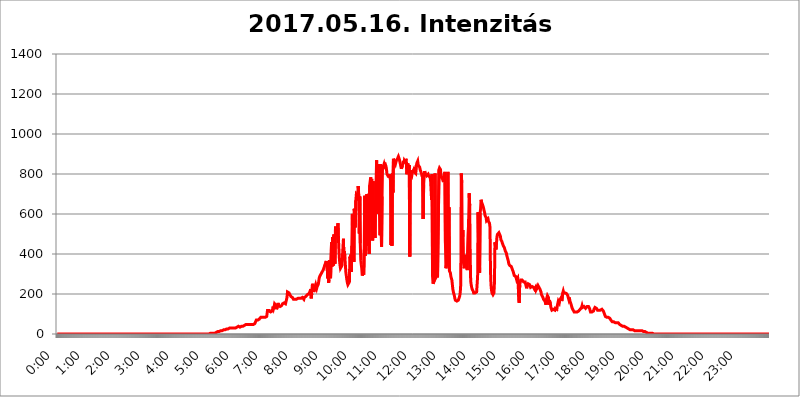
| Category | 2017.05.16. Intenzitás [W/m^2] |
|---|---|
| 0.0 | 0 |
| 0.0006944444444444445 | 0 |
| 0.001388888888888889 | 0 |
| 0.0020833333333333333 | 0 |
| 0.002777777777777778 | 0 |
| 0.003472222222222222 | 0 |
| 0.004166666666666667 | 0 |
| 0.004861111111111111 | 0 |
| 0.005555555555555556 | 0 |
| 0.0062499999999999995 | 0 |
| 0.006944444444444444 | 0 |
| 0.007638888888888889 | 0 |
| 0.008333333333333333 | 0 |
| 0.009027777777777779 | 0 |
| 0.009722222222222222 | 0 |
| 0.010416666666666666 | 0 |
| 0.011111111111111112 | 0 |
| 0.011805555555555555 | 0 |
| 0.012499999999999999 | 0 |
| 0.013194444444444444 | 0 |
| 0.013888888888888888 | 0 |
| 0.014583333333333332 | 0 |
| 0.015277777777777777 | 0 |
| 0.015972222222222224 | 0 |
| 0.016666666666666666 | 0 |
| 0.017361111111111112 | 0 |
| 0.018055555555555557 | 0 |
| 0.01875 | 0 |
| 0.019444444444444445 | 0 |
| 0.02013888888888889 | 0 |
| 0.020833333333333332 | 0 |
| 0.02152777777777778 | 0 |
| 0.022222222222222223 | 0 |
| 0.02291666666666667 | 0 |
| 0.02361111111111111 | 0 |
| 0.024305555555555556 | 0 |
| 0.024999999999999998 | 0 |
| 0.025694444444444447 | 0 |
| 0.02638888888888889 | 0 |
| 0.027083333333333334 | 0 |
| 0.027777777777777776 | 0 |
| 0.02847222222222222 | 0 |
| 0.029166666666666664 | 0 |
| 0.029861111111111113 | 0 |
| 0.030555555555555555 | 0 |
| 0.03125 | 0 |
| 0.03194444444444445 | 0 |
| 0.03263888888888889 | 0 |
| 0.03333333333333333 | 0 |
| 0.034027777777777775 | 0 |
| 0.034722222222222224 | 0 |
| 0.035416666666666666 | 0 |
| 0.036111111111111115 | 0 |
| 0.03680555555555556 | 0 |
| 0.0375 | 0 |
| 0.03819444444444444 | 0 |
| 0.03888888888888889 | 0 |
| 0.03958333333333333 | 0 |
| 0.04027777777777778 | 0 |
| 0.04097222222222222 | 0 |
| 0.041666666666666664 | 0 |
| 0.042361111111111106 | 0 |
| 0.04305555555555556 | 0 |
| 0.043750000000000004 | 0 |
| 0.044444444444444446 | 0 |
| 0.04513888888888889 | 0 |
| 0.04583333333333334 | 0 |
| 0.04652777777777778 | 0 |
| 0.04722222222222222 | 0 |
| 0.04791666666666666 | 0 |
| 0.04861111111111111 | 0 |
| 0.049305555555555554 | 0 |
| 0.049999999999999996 | 0 |
| 0.05069444444444445 | 0 |
| 0.051388888888888894 | 0 |
| 0.052083333333333336 | 0 |
| 0.05277777777777778 | 0 |
| 0.05347222222222222 | 0 |
| 0.05416666666666667 | 0 |
| 0.05486111111111111 | 0 |
| 0.05555555555555555 | 0 |
| 0.05625 | 0 |
| 0.05694444444444444 | 0 |
| 0.057638888888888885 | 0 |
| 0.05833333333333333 | 0 |
| 0.05902777777777778 | 0 |
| 0.059722222222222225 | 0 |
| 0.06041666666666667 | 0 |
| 0.061111111111111116 | 0 |
| 0.06180555555555556 | 0 |
| 0.0625 | 0 |
| 0.06319444444444444 | 0 |
| 0.06388888888888888 | 0 |
| 0.06458333333333334 | 0 |
| 0.06527777777777778 | 0 |
| 0.06597222222222222 | 0 |
| 0.06666666666666667 | 0 |
| 0.06736111111111111 | 0 |
| 0.06805555555555555 | 0 |
| 0.06874999999999999 | 0 |
| 0.06944444444444443 | 0 |
| 0.07013888888888889 | 0 |
| 0.07083333333333333 | 0 |
| 0.07152777777777779 | 0 |
| 0.07222222222222223 | 0 |
| 0.07291666666666667 | 0 |
| 0.07361111111111111 | 0 |
| 0.07430555555555556 | 0 |
| 0.075 | 0 |
| 0.07569444444444444 | 0 |
| 0.0763888888888889 | 0 |
| 0.07708333333333334 | 0 |
| 0.07777777777777778 | 0 |
| 0.07847222222222222 | 0 |
| 0.07916666666666666 | 0 |
| 0.0798611111111111 | 0 |
| 0.08055555555555556 | 0 |
| 0.08125 | 0 |
| 0.08194444444444444 | 0 |
| 0.08263888888888889 | 0 |
| 0.08333333333333333 | 0 |
| 0.08402777777777777 | 0 |
| 0.08472222222222221 | 0 |
| 0.08541666666666665 | 0 |
| 0.08611111111111112 | 0 |
| 0.08680555555555557 | 0 |
| 0.08750000000000001 | 0 |
| 0.08819444444444445 | 0 |
| 0.08888888888888889 | 0 |
| 0.08958333333333333 | 0 |
| 0.09027777777777778 | 0 |
| 0.09097222222222222 | 0 |
| 0.09166666666666667 | 0 |
| 0.09236111111111112 | 0 |
| 0.09305555555555556 | 0 |
| 0.09375 | 0 |
| 0.09444444444444444 | 0 |
| 0.09513888888888888 | 0 |
| 0.09583333333333333 | 0 |
| 0.09652777777777777 | 0 |
| 0.09722222222222222 | 0 |
| 0.09791666666666667 | 0 |
| 0.09861111111111111 | 0 |
| 0.09930555555555555 | 0 |
| 0.09999999999999999 | 0 |
| 0.10069444444444443 | 0 |
| 0.1013888888888889 | 0 |
| 0.10208333333333335 | 0 |
| 0.10277777777777779 | 0 |
| 0.10347222222222223 | 0 |
| 0.10416666666666667 | 0 |
| 0.10486111111111111 | 0 |
| 0.10555555555555556 | 0 |
| 0.10625 | 0 |
| 0.10694444444444444 | 0 |
| 0.1076388888888889 | 0 |
| 0.10833333333333334 | 0 |
| 0.10902777777777778 | 0 |
| 0.10972222222222222 | 0 |
| 0.1111111111111111 | 0 |
| 0.11180555555555556 | 0 |
| 0.11180555555555556 | 0 |
| 0.1125 | 0 |
| 0.11319444444444444 | 0 |
| 0.11388888888888889 | 0 |
| 0.11458333333333333 | 0 |
| 0.11527777777777777 | 0 |
| 0.11597222222222221 | 0 |
| 0.11666666666666665 | 0 |
| 0.1173611111111111 | 0 |
| 0.11805555555555557 | 0 |
| 0.11944444444444445 | 0 |
| 0.12013888888888889 | 0 |
| 0.12083333333333333 | 0 |
| 0.12152777777777778 | 0 |
| 0.12222222222222223 | 0 |
| 0.12291666666666667 | 0 |
| 0.12291666666666667 | 0 |
| 0.12361111111111112 | 0 |
| 0.12430555555555556 | 0 |
| 0.125 | 0 |
| 0.12569444444444444 | 0 |
| 0.12638888888888888 | 0 |
| 0.12708333333333333 | 0 |
| 0.16875 | 0 |
| 0.12847222222222224 | 0 |
| 0.12916666666666668 | 0 |
| 0.12986111111111112 | 0 |
| 0.13055555555555556 | 0 |
| 0.13125 | 0 |
| 0.13194444444444445 | 0 |
| 0.1326388888888889 | 0 |
| 0.13333333333333333 | 0 |
| 0.13402777777777777 | 0 |
| 0.13402777777777777 | 0 |
| 0.13472222222222222 | 0 |
| 0.13541666666666666 | 0 |
| 0.1361111111111111 | 0 |
| 0.13749999999999998 | 0 |
| 0.13819444444444443 | 0 |
| 0.1388888888888889 | 0 |
| 0.13958333333333334 | 0 |
| 0.14027777777777778 | 0 |
| 0.14097222222222222 | 0 |
| 0.14166666666666666 | 0 |
| 0.1423611111111111 | 0 |
| 0.14305555555555557 | 0 |
| 0.14375000000000002 | 0 |
| 0.14444444444444446 | 0 |
| 0.1451388888888889 | 0 |
| 0.1451388888888889 | 0 |
| 0.14652777777777778 | 0 |
| 0.14722222222222223 | 0 |
| 0.14791666666666667 | 0 |
| 0.1486111111111111 | 0 |
| 0.14930555555555555 | 0 |
| 0.15 | 0 |
| 0.15069444444444444 | 0 |
| 0.15138888888888888 | 0 |
| 0.15208333333333332 | 0 |
| 0.15277777777777776 | 0 |
| 0.15347222222222223 | 0 |
| 0.15416666666666667 | 0 |
| 0.15486111111111112 | 0 |
| 0.15555555555555556 | 0 |
| 0.15625 | 0 |
| 0.15694444444444444 | 0 |
| 0.15763888888888888 | 0 |
| 0.15833333333333333 | 0 |
| 0.15902777777777777 | 0 |
| 0.15972222222222224 | 0 |
| 0.16041666666666668 | 0 |
| 0.16111111111111112 | 0 |
| 0.16180555555555556 | 0 |
| 0.1625 | 0 |
| 0.16319444444444445 | 0 |
| 0.1638888888888889 | 0 |
| 0.16458333333333333 | 0 |
| 0.16527777777777777 | 0 |
| 0.16597222222222222 | 0 |
| 0.16666666666666666 | 0 |
| 0.1673611111111111 | 0 |
| 0.16805555555555554 | 0 |
| 0.16874999999999998 | 0 |
| 0.16944444444444443 | 0 |
| 0.17013888888888887 | 0 |
| 0.1708333333333333 | 0 |
| 0.17152777777777775 | 0 |
| 0.17222222222222225 | 0 |
| 0.1729166666666667 | 0 |
| 0.17361111111111113 | 0 |
| 0.17430555555555557 | 0 |
| 0.17500000000000002 | 0 |
| 0.17569444444444446 | 0 |
| 0.1763888888888889 | 0 |
| 0.17708333333333334 | 0 |
| 0.17777777777777778 | 0 |
| 0.17847222222222223 | 0 |
| 0.17916666666666667 | 0 |
| 0.1798611111111111 | 0 |
| 0.18055555555555555 | 0 |
| 0.18125 | 0 |
| 0.18194444444444444 | 0 |
| 0.1826388888888889 | 0 |
| 0.18333333333333335 | 0 |
| 0.1840277777777778 | 0 |
| 0.18472222222222223 | 0 |
| 0.18541666666666667 | 0 |
| 0.18611111111111112 | 0 |
| 0.18680555555555556 | 0 |
| 0.1875 | 0 |
| 0.18819444444444444 | 0 |
| 0.18888888888888888 | 0 |
| 0.18958333333333333 | 0 |
| 0.19027777777777777 | 0 |
| 0.1909722222222222 | 0 |
| 0.19166666666666665 | 0 |
| 0.19236111111111112 | 0 |
| 0.19305555555555554 | 0 |
| 0.19375 | 0 |
| 0.19444444444444445 | 0 |
| 0.1951388888888889 | 0 |
| 0.19583333333333333 | 0 |
| 0.19652777777777777 | 0 |
| 0.19722222222222222 | 0 |
| 0.19791666666666666 | 0 |
| 0.1986111111111111 | 0 |
| 0.19930555555555554 | 0 |
| 0.19999999999999998 | 0 |
| 0.20069444444444443 | 0 |
| 0.20138888888888887 | 0 |
| 0.2020833333333333 | 0 |
| 0.2027777777777778 | 0 |
| 0.2034722222222222 | 0 |
| 0.2041666666666667 | 0 |
| 0.20486111111111113 | 0 |
| 0.20555555555555557 | 0 |
| 0.20625000000000002 | 0 |
| 0.20694444444444446 | 0 |
| 0.2076388888888889 | 0 |
| 0.20833333333333334 | 0 |
| 0.20902777777777778 | 0 |
| 0.20972222222222223 | 0 |
| 0.21041666666666667 | 0 |
| 0.2111111111111111 | 0 |
| 0.21180555555555555 | 0 |
| 0.2125 | 0 |
| 0.21319444444444444 | 3.525 |
| 0.2138888888888889 | 3.525 |
| 0.21458333333333335 | 3.525 |
| 0.2152777777777778 | 3.525 |
| 0.21597222222222223 | 3.525 |
| 0.21666666666666667 | 3.525 |
| 0.21736111111111112 | 3.525 |
| 0.21805555555555556 | 3.525 |
| 0.21875 | 3.525 |
| 0.21944444444444444 | 3.525 |
| 0.22013888888888888 | 3.525 |
| 0.22083333333333333 | 3.525 |
| 0.22152777777777777 | 3.525 |
| 0.2222222222222222 | 7.887 |
| 0.22291666666666665 | 7.887 |
| 0.2236111111111111 | 7.887 |
| 0.22430555555555556 | 7.887 |
| 0.225 | 12.257 |
| 0.22569444444444445 | 12.257 |
| 0.2263888888888889 | 12.257 |
| 0.22708333333333333 | 12.257 |
| 0.22777777777777777 | 12.257 |
| 0.22847222222222222 | 16.636 |
| 0.22916666666666666 | 16.636 |
| 0.2298611111111111 | 16.636 |
| 0.23055555555555554 | 16.636 |
| 0.23124999999999998 | 16.636 |
| 0.23194444444444443 | 21.024 |
| 0.23263888888888887 | 21.024 |
| 0.2333333333333333 | 21.024 |
| 0.2340277777777778 | 21.024 |
| 0.2347222222222222 | 21.024 |
| 0.2354166666666667 | 21.024 |
| 0.23611111111111113 | 21.024 |
| 0.23680555555555557 | 25.419 |
| 0.23750000000000002 | 25.419 |
| 0.23819444444444446 | 25.419 |
| 0.2388888888888889 | 25.419 |
| 0.23958333333333334 | 25.419 |
| 0.24027777777777778 | 25.419 |
| 0.24097222222222223 | 29.823 |
| 0.24166666666666667 | 29.823 |
| 0.2423611111111111 | 29.823 |
| 0.24305555555555555 | 29.823 |
| 0.24375 | 29.823 |
| 0.24444444444444446 | 29.823 |
| 0.24513888888888888 | 29.823 |
| 0.24583333333333335 | 29.823 |
| 0.2465277777777778 | 29.823 |
| 0.24722222222222223 | 29.823 |
| 0.24791666666666667 | 29.823 |
| 0.24861111111111112 | 34.234 |
| 0.24930555555555556 | 34.234 |
| 0.25 | 29.823 |
| 0.25069444444444444 | 34.234 |
| 0.2513888888888889 | 34.234 |
| 0.2520833333333333 | 34.234 |
| 0.25277777777777777 | 34.234 |
| 0.2534722222222222 | 38.653 |
| 0.25416666666666665 | 38.653 |
| 0.2548611111111111 | 38.653 |
| 0.2555555555555556 | 34.234 |
| 0.25625000000000003 | 34.234 |
| 0.2569444444444445 | 34.234 |
| 0.2576388888888889 | 34.234 |
| 0.25833333333333336 | 38.653 |
| 0.2590277777777778 | 38.653 |
| 0.25972222222222224 | 38.653 |
| 0.2604166666666667 | 38.653 |
| 0.2611111111111111 | 38.653 |
| 0.26180555555555557 | 43.079 |
| 0.2625 | 43.079 |
| 0.26319444444444445 | 47.511 |
| 0.2638888888888889 | 47.511 |
| 0.26458333333333334 | 47.511 |
| 0.2652777777777778 | 47.511 |
| 0.2659722222222222 | 47.511 |
| 0.26666666666666666 | 47.511 |
| 0.2673611111111111 | 47.511 |
| 0.26805555555555555 | 47.511 |
| 0.26875 | 47.511 |
| 0.26944444444444443 | 47.511 |
| 0.2701388888888889 | 47.511 |
| 0.2708333333333333 | 47.511 |
| 0.27152777777777776 | 47.511 |
| 0.2722222222222222 | 47.511 |
| 0.27291666666666664 | 47.511 |
| 0.2736111111111111 | 47.511 |
| 0.2743055555555555 | 47.511 |
| 0.27499999999999997 | 47.511 |
| 0.27569444444444446 | 47.511 |
| 0.27638888888888885 | 51.951 |
| 0.27708333333333335 | 51.951 |
| 0.2777777777777778 | 56.398 |
| 0.27847222222222223 | 56.398 |
| 0.2791666666666667 | 69.775 |
| 0.2798611111111111 | 65.31 |
| 0.28055555555555556 | 65.31 |
| 0.28125 | 69.775 |
| 0.28194444444444444 | 74.246 |
| 0.2826388888888889 | 74.246 |
| 0.2833333333333333 | 74.246 |
| 0.28402777777777777 | 78.722 |
| 0.2847222222222222 | 78.722 |
| 0.28541666666666665 | 83.205 |
| 0.28611111111111115 | 83.205 |
| 0.28680555555555554 | 83.205 |
| 0.28750000000000003 | 83.205 |
| 0.2881944444444445 | 83.205 |
| 0.2888888888888889 | 83.205 |
| 0.28958333333333336 | 83.205 |
| 0.2902777777777778 | 83.205 |
| 0.29097222222222224 | 83.205 |
| 0.2916666666666667 | 83.205 |
| 0.2923611111111111 | 83.205 |
| 0.29305555555555557 | 83.205 |
| 0.29375 | 87.692 |
| 0.29444444444444445 | 92.184 |
| 0.2951388888888889 | 123.758 |
| 0.29583333333333334 | 110.201 |
| 0.2965277777777778 | 123.758 |
| 0.2972222222222222 | 114.716 |
| 0.29791666666666666 | 119.235 |
| 0.2986111111111111 | 110.201 |
| 0.29930555555555555 | 110.201 |
| 0.3 | 105.69 |
| 0.30069444444444443 | 110.201 |
| 0.3013888888888889 | 114.716 |
| 0.3020833333333333 | 123.758 |
| 0.30277777777777776 | 137.347 |
| 0.3034722222222222 | 128.284 |
| 0.30416666666666664 | 137.347 |
| 0.3048611111111111 | 150.964 |
| 0.3055555555555555 | 150.964 |
| 0.30624999999999997 | 150.964 |
| 0.3069444444444444 | 141.884 |
| 0.3076388888888889 | 123.758 |
| 0.30833333333333335 | 119.235 |
| 0.3090277777777778 | 141.884 |
| 0.30972222222222223 | 155.509 |
| 0.3104166666666667 | 141.884 |
| 0.3111111111111111 | 137.347 |
| 0.31180555555555556 | 141.884 |
| 0.3125 | 137.347 |
| 0.31319444444444444 | 137.347 |
| 0.3138888888888889 | 137.347 |
| 0.3145833333333333 | 141.884 |
| 0.31527777777777777 | 146.423 |
| 0.3159722222222222 | 150.964 |
| 0.31666666666666665 | 155.509 |
| 0.31736111111111115 | 155.509 |
| 0.31805555555555554 | 155.509 |
| 0.31875000000000003 | 150.964 |
| 0.3194444444444445 | 150.964 |
| 0.3201388888888889 | 150.964 |
| 0.32083333333333336 | 150.964 |
| 0.3215277777777778 | 155.509 |
| 0.32222222222222224 | 182.82 |
| 0.3229166666666667 | 210.182 |
| 0.3236111111111111 | 214.746 |
| 0.32430555555555557 | 210.182 |
| 0.325 | 205.62 |
| 0.32569444444444445 | 201.058 |
| 0.3263888888888889 | 196.497 |
| 0.32708333333333334 | 191.937 |
| 0.3277777777777778 | 187.378 |
| 0.3284722222222222 | 182.82 |
| 0.32916666666666666 | 182.82 |
| 0.3298611111111111 | 182.82 |
| 0.33055555555555555 | 178.264 |
| 0.33125 | 173.709 |
| 0.33194444444444443 | 173.709 |
| 0.3326388888888889 | 173.709 |
| 0.3333333333333333 | 173.709 |
| 0.3340277777777778 | 173.709 |
| 0.3347222222222222 | 173.709 |
| 0.3354166666666667 | 173.709 |
| 0.3361111111111111 | 178.264 |
| 0.3368055555555556 | 178.264 |
| 0.33749999999999997 | 178.264 |
| 0.33819444444444446 | 178.264 |
| 0.33888888888888885 | 178.264 |
| 0.33958333333333335 | 178.264 |
| 0.34027777777777773 | 178.264 |
| 0.34097222222222223 | 178.264 |
| 0.3416666666666666 | 178.264 |
| 0.3423611111111111 | 178.264 |
| 0.3430555555555555 | 182.82 |
| 0.34375 | 182.82 |
| 0.3444444444444445 | 182.82 |
| 0.3451388888888889 | 182.82 |
| 0.3458333333333334 | 173.709 |
| 0.34652777777777777 | 182.82 |
| 0.34722222222222227 | 187.378 |
| 0.34791666666666665 | 187.378 |
| 0.34861111111111115 | 187.378 |
| 0.34930555555555554 | 191.937 |
| 0.35000000000000003 | 191.937 |
| 0.3506944444444444 | 196.497 |
| 0.3513888888888889 | 196.497 |
| 0.3520833333333333 | 196.497 |
| 0.3527777777777778 | 201.058 |
| 0.3534722222222222 | 201.058 |
| 0.3541666666666667 | 210.182 |
| 0.3548611111111111 | 214.746 |
| 0.35555555555555557 | 223.873 |
| 0.35625 | 178.264 |
| 0.35694444444444445 | 201.058 |
| 0.3576388888888889 | 242.127 |
| 0.35833333333333334 | 251.251 |
| 0.3590277777777778 | 251.251 |
| 0.3597222222222222 | 210.182 |
| 0.36041666666666666 | 214.746 |
| 0.3611111111111111 | 228.436 |
| 0.36180555555555555 | 237.564 |
| 0.3625 | 246.689 |
| 0.36319444444444443 | 242.127 |
| 0.3638888888888889 | 228.436 |
| 0.3645833333333333 | 237.564 |
| 0.3652777777777778 | 237.564 |
| 0.3659722222222222 | 246.689 |
| 0.3666666666666667 | 260.373 |
| 0.3673611111111111 | 278.603 |
| 0.3680555555555556 | 287.709 |
| 0.36874999999999997 | 292.259 |
| 0.36944444444444446 | 292.259 |
| 0.37013888888888885 | 301.354 |
| 0.37083333333333335 | 305.898 |
| 0.37152777777777773 | 310.44 |
| 0.37222222222222223 | 314.98 |
| 0.3729166666666666 | 319.517 |
| 0.3736111111111111 | 324.052 |
| 0.3743055555555555 | 333.113 |
| 0.375 | 342.162 |
| 0.3756944444444445 | 346.682 |
| 0.3763888888888889 | 355.712 |
| 0.3770833333333334 | 364.728 |
| 0.37777777777777777 | 351.198 |
| 0.37847222222222227 | 364.728 |
| 0.37916666666666665 | 278.603 |
| 0.37986111111111115 | 319.517 |
| 0.38055555555555554 | 255.813 |
| 0.38125000000000003 | 269.49 |
| 0.3819444444444444 | 369.23 |
| 0.3826388888888889 | 314.98 |
| 0.3833333333333333 | 278.603 |
| 0.3840277777777778 | 278.603 |
| 0.3847222222222222 | 458.38 |
| 0.3854166666666667 | 337.639 |
| 0.3861111111111111 | 484.735 |
| 0.38680555555555557 | 414.035 |
| 0.3875 | 342.162 |
| 0.38819444444444445 | 497.836 |
| 0.3888888888888889 | 364.728 |
| 0.38958333333333334 | 351.198 |
| 0.3902777777777778 | 536.82 |
| 0.3909722222222222 | 541.121 |
| 0.39166666666666666 | 532.513 |
| 0.3923611111111111 | 489.108 |
| 0.39305555555555555 | 523.88 |
| 0.39375 | 553.986 |
| 0.39444444444444443 | 471.582 |
| 0.3951388888888889 | 414.035 |
| 0.3958333333333333 | 369.23 |
| 0.3965277777777778 | 346.682 |
| 0.3972222222222222 | 328.584 |
| 0.3979166666666667 | 328.584 |
| 0.3986111111111111 | 333.113 |
| 0.3993055555555556 | 342.162 |
| 0.39999999999999997 | 342.162 |
| 0.40069444444444446 | 346.682 |
| 0.40138888888888885 | 475.972 |
| 0.40208333333333335 | 369.23 |
| 0.40277777777777773 | 414.035 |
| 0.40347222222222223 | 378.224 |
| 0.4041666666666666 | 342.162 |
| 0.4048611111111111 | 305.898 |
| 0.4055555555555555 | 287.709 |
| 0.40625 | 269.49 |
| 0.4069444444444445 | 255.813 |
| 0.4076388888888889 | 246.689 |
| 0.4083333333333334 | 246.689 |
| 0.40902777777777777 | 251.251 |
| 0.40972222222222227 | 260.373 |
| 0.41041666666666665 | 387.202 |
| 0.41111111111111115 | 378.224 |
| 0.41180555555555554 | 396.164 |
| 0.41250000000000003 | 310.44 |
| 0.4131944444444444 | 440.702 |
| 0.4138888888888889 | 600.661 |
| 0.4145833333333333 | 378.224 |
| 0.4152777777777778 | 588.009 |
| 0.4159722222222222 | 360.221 |
| 0.4166666666666667 | 625.784 |
| 0.4173611111111111 | 545.416 |
| 0.41805555555555557 | 532.513 |
| 0.41875 | 667.123 |
| 0.41944444444444445 | 695.666 |
| 0.4201388888888889 | 691.608 |
| 0.42083333333333334 | 687.544 |
| 0.4215277777777778 | 667.123 |
| 0.4222222222222222 | 739.877 |
| 0.42291666666666666 | 683.473 |
| 0.4236111111111111 | 502.192 |
| 0.42430555555555555 | 687.544 |
| 0.425 | 453.968 |
| 0.42569444444444443 | 369.23 |
| 0.4263888888888889 | 346.682 |
| 0.4270833333333333 | 328.584 |
| 0.4277777777777778 | 292.259 |
| 0.4284722222222222 | 287.709 |
| 0.4291666666666667 | 305.898 |
| 0.4298611111111111 | 296.808 |
| 0.4305555555555556 | 422.943 |
| 0.43124999999999997 | 691.608 |
| 0.43194444444444446 | 391.685 |
| 0.43263888888888885 | 502.192 |
| 0.43333333333333335 | 650.667 |
| 0.43402777777777773 | 699.717 |
| 0.43472222222222223 | 691.608 |
| 0.4354166666666666 | 634.105 |
| 0.4361111111111111 | 440.702 |
| 0.4368055555555555 | 541.121 |
| 0.4375 | 400.638 |
| 0.4381944444444445 | 743.859 |
| 0.4388888888888889 | 747.834 |
| 0.4395833333333334 | 783.342 |
| 0.44027777777777777 | 755.766 |
| 0.44097222222222227 | 775.492 |
| 0.44166666666666665 | 642.4 |
| 0.44236111111111115 | 467.187 |
| 0.44305555555555554 | 763.674 |
| 0.44375000000000003 | 588.009 |
| 0.4444444444444444 | 553.986 |
| 0.4451388888888889 | 502.192 |
| 0.4458333333333333 | 480.356 |
| 0.4465277777777778 | 715.858 |
| 0.4472222222222222 | 759.723 |
| 0.4479166666666667 | 868.305 |
| 0.4486111111111111 | 600.661 |
| 0.44930555555555557 | 849.199 |
| 0.45 | 818.392 |
| 0.45069444444444445 | 695.666 |
| 0.4513888888888889 | 715.858 |
| 0.45208333333333334 | 592.233 |
| 0.4527777777777778 | 493.475 |
| 0.4534722222222222 | 849.199 |
| 0.45416666666666666 | 528.2 |
| 0.4548611111111111 | 436.27 |
| 0.45555555555555555 | 687.544 |
| 0.45625 | 845.365 |
| 0.45694444444444443 | 833.834 |
| 0.4576388888888889 | 841.526 |
| 0.4583333333333333 | 849.199 |
| 0.4590277777777778 | 837.682 |
| 0.4597222222222222 | 837.682 |
| 0.4604166666666667 | 845.365 |
| 0.4611111111111111 | 837.682 |
| 0.4618055555555556 | 822.26 |
| 0.46249999999999997 | 798.974 |
| 0.46319444444444446 | 802.868 |
| 0.46388888888888885 | 791.169 |
| 0.46458333333333335 | 783.342 |
| 0.46527777777777773 | 798.974 |
| 0.46597222222222223 | 783.342 |
| 0.4666666666666666 | 798.974 |
| 0.4673611111111111 | 767.62 |
| 0.4680555555555555 | 445.129 |
| 0.46875 | 715.858 |
| 0.4694444444444445 | 440.702 |
| 0.4701388888888889 | 802.868 |
| 0.4708333333333334 | 707.8 |
| 0.47152777777777777 | 875.918 |
| 0.47222222222222227 | 868.305 |
| 0.47291666666666665 | 860.676 |
| 0.47361111111111115 | 864.493 |
| 0.47430555555555554 | 849.199 |
| 0.47500000000000003 | 845.365 |
| 0.4756944444444444 | 868.305 |
| 0.4763888888888889 | 872.114 |
| 0.4770833333333333 | 875.918 |
| 0.4777777777777778 | 879.719 |
| 0.4784722222222222 | 887.309 |
| 0.4791666666666667 | 883.516 |
| 0.4798611111111111 | 872.114 |
| 0.48055555555555557 | 860.676 |
| 0.48125 | 849.199 |
| 0.48194444444444445 | 845.365 |
| 0.4826388888888889 | 826.123 |
| 0.48333333333333334 | 822.26 |
| 0.4840277777777778 | 841.526 |
| 0.4847222222222222 | 849.199 |
| 0.48541666666666666 | 864.493 |
| 0.4861111111111111 | 853.029 |
| 0.48680555555555555 | 868.305 |
| 0.4875 | 868.305 |
| 0.48819444444444443 | 860.676 |
| 0.4888888888888889 | 875.918 |
| 0.4895833333333333 | 868.305 |
| 0.4902777777777778 | 798.974 |
| 0.4909722222222222 | 837.682 |
| 0.4916666666666667 | 853.029 |
| 0.4923611111111111 | 837.682 |
| 0.4930555555555556 | 826.123 |
| 0.49374999999999997 | 845.365 |
| 0.49444444444444446 | 387.202 |
| 0.49513888888888885 | 818.392 |
| 0.49583333333333335 | 798.974 |
| 0.49652777777777773 | 802.868 |
| 0.49722222222222223 | 791.169 |
| 0.4979166666666666 | 806.757 |
| 0.4986111111111111 | 806.757 |
| 0.4993055555555555 | 802.868 |
| 0.5 | 822.26 |
| 0.5006944444444444 | 810.641 |
| 0.5013888888888889 | 814.519 |
| 0.5020833333333333 | 814.519 |
| 0.5027777777777778 | 802.868 |
| 0.5034722222222222 | 826.123 |
| 0.5041666666666667 | 853.029 |
| 0.5048611111111111 | 853.029 |
| 0.5055555555555555 | 864.493 |
| 0.50625 | 845.365 |
| 0.5069444444444444 | 845.365 |
| 0.5076388888888889 | 841.526 |
| 0.5083333333333333 | 833.834 |
| 0.5090277777777777 | 822.26 |
| 0.5097222222222222 | 814.519 |
| 0.5104166666666666 | 810.641 |
| 0.5111111111111112 | 798.974 |
| 0.5118055555555555 | 787.258 |
| 0.5125000000000001 | 798.974 |
| 0.5131944444444444 | 575.299 |
| 0.513888888888889 | 747.834 |
| 0.5145833333333333 | 787.258 |
| 0.5152777777777778 | 814.519 |
| 0.5159722222222222 | 802.868 |
| 0.5166666666666667 | 802.868 |
| 0.517361111111111 | 798.974 |
| 0.5180555555555556 | 791.169 |
| 0.5187499999999999 | 795.074 |
| 0.5194444444444445 | 795.074 |
| 0.5201388888888888 | 798.974 |
| 0.5208333333333334 | 791.169 |
| 0.5215277777777778 | 791.169 |
| 0.5222222222222223 | 787.258 |
| 0.5229166666666667 | 783.342 |
| 0.5236111111111111 | 767.62 |
| 0.5243055555555556 | 771.559 |
| 0.525 | 671.22 |
| 0.5256944444444445 | 798.974 |
| 0.5263888888888889 | 287.709 |
| 0.5270833333333333 | 251.251 |
| 0.5277777777777778 | 255.813 |
| 0.5284722222222222 | 264.932 |
| 0.5291666666666667 | 314.98 |
| 0.5298611111111111 | 802.868 |
| 0.5305555555555556 | 355.712 |
| 0.53125 | 283.156 |
| 0.5319444444444444 | 283.156 |
| 0.5326388888888889 | 292.259 |
| 0.5333333333333333 | 283.156 |
| 0.5340277777777778 | 278.603 |
| 0.5347222222222222 | 287.709 |
| 0.5354166666666667 | 822.26 |
| 0.5361111111111111 | 829.981 |
| 0.5368055555555555 | 833.834 |
| 0.5375 | 822.26 |
| 0.5381944444444444 | 791.169 |
| 0.5388888888888889 | 787.258 |
| 0.5395833333333333 | 791.169 |
| 0.5402777777777777 | 775.492 |
| 0.5409722222222222 | 767.62 |
| 0.5416666666666666 | 759.723 |
| 0.5423611111111112 | 791.169 |
| 0.5430555555555555 | 787.258 |
| 0.5437500000000001 | 810.641 |
| 0.5444444444444444 | 453.968 |
| 0.545138888888889 | 328.584 |
| 0.5458333333333333 | 333.113 |
| 0.5465277777777778 | 360.221 |
| 0.5472222222222222 | 369.23 |
| 0.5479166666666667 | 810.641 |
| 0.548611111111111 | 351.198 |
| 0.5493055555555556 | 634.105 |
| 0.5499999999999999 | 314.98 |
| 0.5506944444444445 | 310.44 |
| 0.5513888888888888 | 305.898 |
| 0.5520833333333334 | 287.709 |
| 0.5527777777777778 | 283.156 |
| 0.5534722222222223 | 269.49 |
| 0.5541666666666667 | 246.689 |
| 0.5548611111111111 | 223.873 |
| 0.5555555555555556 | 210.182 |
| 0.55625 | 201.058 |
| 0.5569444444444445 | 191.937 |
| 0.5576388888888889 | 178.264 |
| 0.5583333333333333 | 169.156 |
| 0.5590277777777778 | 164.605 |
| 0.5597222222222222 | 164.605 |
| 0.5604166666666667 | 164.605 |
| 0.5611111111111111 | 169.156 |
| 0.5618055555555556 | 169.156 |
| 0.5625 | 169.156 |
| 0.5631944444444444 | 173.709 |
| 0.5638888888888889 | 182.82 |
| 0.5645833333333333 | 191.937 |
| 0.5652777777777778 | 210.182 |
| 0.5659722222222222 | 251.251 |
| 0.5666666666666667 | 802.868 |
| 0.5673611111111111 | 755.766 |
| 0.5680555555555555 | 400.638 |
| 0.56875 | 519.555 |
| 0.5694444444444444 | 364.728 |
| 0.5701388888888889 | 360.221 |
| 0.5708333333333333 | 328.584 |
| 0.5715277777777777 | 351.198 |
| 0.5722222222222222 | 396.164 |
| 0.5729166666666666 | 369.23 |
| 0.5736111111111112 | 373.729 |
| 0.5743055555555555 | 346.682 |
| 0.5750000000000001 | 319.517 |
| 0.5756944444444444 | 324.052 |
| 0.576388888888889 | 324.052 |
| 0.5770833333333333 | 575.299 |
| 0.5777777777777778 | 703.762 |
| 0.5784722222222222 | 642.4 |
| 0.5791666666666667 | 391.685 |
| 0.579861111111111 | 264.932 |
| 0.5805555555555556 | 246.689 |
| 0.5812499999999999 | 233 |
| 0.5819444444444445 | 223.873 |
| 0.5826388888888888 | 219.309 |
| 0.5833333333333334 | 214.746 |
| 0.5840277777777778 | 205.62 |
| 0.5847222222222223 | 201.058 |
| 0.5854166666666667 | 205.62 |
| 0.5861111111111111 | 205.62 |
| 0.5868055555555556 | 205.62 |
| 0.5875 | 205.62 |
| 0.5881944444444445 | 210.182 |
| 0.5888888888888889 | 210.182 |
| 0.5895833333333333 | 287.709 |
| 0.5902777777777778 | 609.062 |
| 0.5909722222222222 | 440.702 |
| 0.5916666666666667 | 523.88 |
| 0.5923611111111111 | 305.898 |
| 0.5930555555555556 | 604.864 |
| 0.59375 | 625.784 |
| 0.5944444444444444 | 671.22 |
| 0.5951388888888889 | 658.909 |
| 0.5958333333333333 | 654.791 |
| 0.5965277777777778 | 646.537 |
| 0.5972222222222222 | 638.256 |
| 0.5979166666666667 | 629.948 |
| 0.5986111111111111 | 617.436 |
| 0.5993055555555555 | 609.062 |
| 0.6 | 592.233 |
| 0.6006944444444444 | 592.233 |
| 0.6013888888888889 | 583.779 |
| 0.6020833333333333 | 566.793 |
| 0.6027777777777777 | 566.793 |
| 0.6034722222222222 | 571.049 |
| 0.6041666666666666 | 575.299 |
| 0.6048611111111112 | 562.53 |
| 0.6055555555555555 | 558.261 |
| 0.6062500000000001 | 553.986 |
| 0.6069444444444444 | 532.513 |
| 0.607638888888889 | 314.98 |
| 0.6083333333333333 | 246.689 |
| 0.6090277777777778 | 219.309 |
| 0.6097222222222222 | 205.62 |
| 0.6104166666666667 | 201.058 |
| 0.611111111111111 | 196.497 |
| 0.6118055555555556 | 201.058 |
| 0.6124999999999999 | 205.62 |
| 0.6131944444444445 | 255.813 |
| 0.6138888888888888 | 458.38 |
| 0.6145833333333334 | 453.968 |
| 0.6152777777777778 | 422.943 |
| 0.6159722222222223 | 449.551 |
| 0.6166666666666667 | 484.735 |
| 0.6173611111111111 | 497.836 |
| 0.6180555555555556 | 502.192 |
| 0.61875 | 493.475 |
| 0.6194444444444445 | 506.542 |
| 0.6201388888888889 | 506.542 |
| 0.6208333333333333 | 502.192 |
| 0.6215277777777778 | 489.108 |
| 0.6222222222222222 | 471.582 |
| 0.6229166666666667 | 475.972 |
| 0.6236111111111111 | 462.786 |
| 0.6243055555555556 | 453.968 |
| 0.625 | 449.551 |
| 0.6256944444444444 | 440.702 |
| 0.6263888888888889 | 436.27 |
| 0.6270833333333333 | 431.833 |
| 0.6277777777777778 | 422.943 |
| 0.6284722222222222 | 414.035 |
| 0.6291666666666667 | 409.574 |
| 0.6298611111111111 | 405.108 |
| 0.6305555555555555 | 391.685 |
| 0.63125 | 382.715 |
| 0.6319444444444444 | 373.729 |
| 0.6326388888888889 | 364.728 |
| 0.6333333333333333 | 351.198 |
| 0.6340277777777777 | 346.682 |
| 0.6347222222222222 | 342.162 |
| 0.6354166666666666 | 342.162 |
| 0.6361111111111112 | 342.162 |
| 0.6368055555555555 | 337.639 |
| 0.6375000000000001 | 337.639 |
| 0.6381944444444444 | 324.052 |
| 0.638888888888889 | 319.517 |
| 0.6395833333333333 | 310.44 |
| 0.6402777777777778 | 305.898 |
| 0.6409722222222222 | 292.259 |
| 0.6416666666666667 | 296.808 |
| 0.642361111111111 | 292.259 |
| 0.6430555555555556 | 287.709 |
| 0.6437499999999999 | 292.259 |
| 0.6444444444444445 | 269.49 |
| 0.6451388888888888 | 274.047 |
| 0.6458333333333334 | 278.603 |
| 0.6465277777777778 | 246.689 |
| 0.6472222222222223 | 173.709 |
| 0.6479166666666667 | 155.509 |
| 0.6486111111111111 | 246.689 |
| 0.6493055555555556 | 242.127 |
| 0.65 | 269.49 |
| 0.6506944444444445 | 269.49 |
| 0.6513888888888889 | 264.932 |
| 0.6520833333333333 | 269.49 |
| 0.6527777777777778 | 264.932 |
| 0.6534722222222222 | 264.932 |
| 0.6541666666666667 | 260.373 |
| 0.6548611111111111 | 255.813 |
| 0.6555555555555556 | 260.373 |
| 0.65625 | 260.373 |
| 0.6569444444444444 | 255.813 |
| 0.6576388888888889 | 255.813 |
| 0.6583333333333333 | 228.436 |
| 0.6590277777777778 | 242.127 |
| 0.6597222222222222 | 246.689 |
| 0.6604166666666667 | 251.251 |
| 0.6611111111111111 | 246.689 |
| 0.6618055555555555 | 251.251 |
| 0.6625 | 246.689 |
| 0.6631944444444444 | 251.251 |
| 0.6638888888888889 | 233 |
| 0.6645833333333333 | 233 |
| 0.6652777777777777 | 233 |
| 0.6659722222222222 | 237.564 |
| 0.6666666666666666 | 242.127 |
| 0.6673611111111111 | 233 |
| 0.6680555555555556 | 233 |
| 0.6687500000000001 | 237.564 |
| 0.6694444444444444 | 223.873 |
| 0.6701388888888888 | 228.436 |
| 0.6708333333333334 | 233 |
| 0.6715277777777778 | 219.309 |
| 0.6722222222222222 | 223.873 |
| 0.6729166666666666 | 228.436 |
| 0.6736111111111112 | 233 |
| 0.6743055555555556 | 242.127 |
| 0.6749999999999999 | 237.564 |
| 0.6756944444444444 | 233 |
| 0.6763888888888889 | 233 |
| 0.6770833333333334 | 223.873 |
| 0.6777777777777777 | 219.309 |
| 0.6784722222222223 | 210.182 |
| 0.6791666666666667 | 196.497 |
| 0.6798611111111111 | 201.058 |
| 0.6805555555555555 | 191.937 |
| 0.68125 | 182.82 |
| 0.6819444444444445 | 173.709 |
| 0.6826388888888889 | 169.156 |
| 0.6833333333333332 | 169.156 |
| 0.6840277777777778 | 164.605 |
| 0.6847222222222222 | 160.056 |
| 0.6854166666666667 | 146.423 |
| 0.686111111111111 | 173.709 |
| 0.6868055555555556 | 178.264 |
| 0.6875 | 191.937 |
| 0.6881944444444444 | 187.378 |
| 0.688888888888889 | 182.82 |
| 0.6895833333333333 | 146.423 |
| 0.6902777777777778 | 169.156 |
| 0.6909722222222222 | 169.156 |
| 0.6916666666666668 | 150.964 |
| 0.6923611111111111 | 132.814 |
| 0.6930555555555555 | 137.347 |
| 0.69375 | 119.235 |
| 0.6944444444444445 | 123.758 |
| 0.6951388888888889 | 123.758 |
| 0.6958333333333333 | 123.758 |
| 0.6965277777777777 | 128.284 |
| 0.6972222222222223 | 123.758 |
| 0.6979166666666666 | 119.235 |
| 0.6986111111111111 | 128.284 |
| 0.6993055555555556 | 128.284 |
| 0.7000000000000001 | 128.284 |
| 0.7006944444444444 | 123.758 |
| 0.7013888888888888 | 141.884 |
| 0.7020833333333334 | 141.884 |
| 0.7027777777777778 | 164.605 |
| 0.7034722222222222 | 164.605 |
| 0.7041666666666666 | 155.509 |
| 0.7048611111111112 | 169.156 |
| 0.7055555555555556 | 173.709 |
| 0.7062499999999999 | 169.156 |
| 0.7069444444444444 | 182.82 |
| 0.7076388888888889 | 164.605 |
| 0.7083333333333334 | 169.156 |
| 0.7090277777777777 | 205.62 |
| 0.7097222222222223 | 214.746 |
| 0.7104166666666667 | 205.62 |
| 0.7111111111111111 | 210.182 |
| 0.7118055555555555 | 201.058 |
| 0.7125 | 205.62 |
| 0.7131944444444445 | 201.058 |
| 0.7138888888888889 | 210.182 |
| 0.7145833333333332 | 201.058 |
| 0.7152777777777778 | 196.497 |
| 0.7159722222222222 | 191.937 |
| 0.7166666666666667 | 182.82 |
| 0.717361111111111 | 173.709 |
| 0.7180555555555556 | 182.82 |
| 0.71875 | 169.156 |
| 0.7194444444444444 | 169.156 |
| 0.720138888888889 | 164.605 |
| 0.7208333333333333 | 146.423 |
| 0.7215277777777778 | 137.347 |
| 0.7222222222222222 | 128.284 |
| 0.7229166666666668 | 123.758 |
| 0.7236111111111111 | 119.235 |
| 0.7243055555555555 | 119.235 |
| 0.725 | 110.201 |
| 0.7256944444444445 | 105.69 |
| 0.7263888888888889 | 105.69 |
| 0.7270833333333333 | 110.201 |
| 0.7277777777777777 | 110.201 |
| 0.7284722222222223 | 105.69 |
| 0.7291666666666666 | 110.201 |
| 0.7298611111111111 | 110.201 |
| 0.7305555555555556 | 114.716 |
| 0.7312500000000001 | 114.716 |
| 0.7319444444444444 | 114.716 |
| 0.7326388888888888 | 119.235 |
| 0.7333333333333334 | 123.758 |
| 0.7340277777777778 | 123.758 |
| 0.7347222222222222 | 123.758 |
| 0.7354166666666666 | 132.814 |
| 0.7361111111111112 | 141.884 |
| 0.7368055555555556 | 132.814 |
| 0.7374999999999999 | 132.814 |
| 0.7381944444444444 | 137.347 |
| 0.7388888888888889 | 137.347 |
| 0.7395833333333334 | 137.347 |
| 0.7402777777777777 | 132.814 |
| 0.7409722222222223 | 128.284 |
| 0.7416666666666667 | 123.758 |
| 0.7423611111111111 | 128.284 |
| 0.7430555555555555 | 137.347 |
| 0.74375 | 141.884 |
| 0.7444444444444445 | 137.347 |
| 0.7451388888888889 | 137.347 |
| 0.7458333333333332 | 137.347 |
| 0.7465277777777778 | 128.284 |
| 0.7472222222222222 | 119.235 |
| 0.7479166666666667 | 110.201 |
| 0.748611111111111 | 110.201 |
| 0.7493055555555556 | 110.201 |
| 0.75 | 110.201 |
| 0.7506944444444444 | 110.201 |
| 0.751388888888889 | 110.201 |
| 0.7520833333333333 | 114.716 |
| 0.7527777777777778 | 123.758 |
| 0.7534722222222222 | 128.284 |
| 0.7541666666666668 | 132.814 |
| 0.7548611111111111 | 128.284 |
| 0.7555555555555555 | 132.814 |
| 0.75625 | 128.284 |
| 0.7569444444444445 | 123.758 |
| 0.7576388888888889 | 119.235 |
| 0.7583333333333333 | 119.235 |
| 0.7590277777777777 | 119.235 |
| 0.7597222222222223 | 119.235 |
| 0.7604166666666666 | 119.235 |
| 0.7611111111111111 | 119.235 |
| 0.7618055555555556 | 119.235 |
| 0.7625000000000001 | 119.235 |
| 0.7631944444444444 | 123.758 |
| 0.7638888888888888 | 123.758 |
| 0.7645833333333334 | 119.235 |
| 0.7652777777777778 | 119.235 |
| 0.7659722222222222 | 114.716 |
| 0.7666666666666666 | 110.201 |
| 0.7673611111111112 | 101.184 |
| 0.7680555555555556 | 96.682 |
| 0.7687499999999999 | 87.692 |
| 0.7694444444444444 | 83.205 |
| 0.7701388888888889 | 83.205 |
| 0.7708333333333334 | 83.205 |
| 0.7715277777777777 | 83.205 |
| 0.7722222222222223 | 83.205 |
| 0.7729166666666667 | 83.205 |
| 0.7736111111111111 | 83.205 |
| 0.7743055555555555 | 83.205 |
| 0.775 | 78.722 |
| 0.7756944444444445 | 74.246 |
| 0.7763888888888889 | 69.775 |
| 0.7770833333333332 | 65.31 |
| 0.7777777777777778 | 65.31 |
| 0.7784722222222222 | 60.85 |
| 0.7791666666666667 | 60.85 |
| 0.779861111111111 | 60.85 |
| 0.7805555555555556 | 60.85 |
| 0.78125 | 60.85 |
| 0.7819444444444444 | 60.85 |
| 0.782638888888889 | 56.398 |
| 0.7833333333333333 | 56.398 |
| 0.7840277777777778 | 56.398 |
| 0.7847222222222222 | 56.398 |
| 0.7854166666666668 | 56.398 |
| 0.7861111111111111 | 56.398 |
| 0.7868055555555555 | 56.398 |
| 0.7875 | 51.951 |
| 0.7881944444444445 | 51.951 |
| 0.7888888888888889 | 47.511 |
| 0.7895833333333333 | 47.511 |
| 0.7902777777777777 | 47.511 |
| 0.7909722222222223 | 43.079 |
| 0.7916666666666666 | 43.079 |
| 0.7923611111111111 | 43.079 |
| 0.7930555555555556 | 38.653 |
| 0.7937500000000001 | 38.653 |
| 0.7944444444444444 | 38.653 |
| 0.7951388888888888 | 38.653 |
| 0.7958333333333334 | 38.653 |
| 0.7965277777777778 | 38.653 |
| 0.7972222222222222 | 34.234 |
| 0.7979166666666666 | 34.234 |
| 0.7986111111111112 | 34.234 |
| 0.7993055555555556 | 29.823 |
| 0.7999999999999999 | 29.823 |
| 0.8006944444444444 | 29.823 |
| 0.8013888888888889 | 25.419 |
| 0.8020833333333334 | 25.419 |
| 0.8027777777777777 | 25.419 |
| 0.8034722222222223 | 21.024 |
| 0.8041666666666667 | 21.024 |
| 0.8048611111111111 | 21.024 |
| 0.8055555555555555 | 21.024 |
| 0.80625 | 21.024 |
| 0.8069444444444445 | 21.024 |
| 0.8076388888888889 | 21.024 |
| 0.8083333333333332 | 16.636 |
| 0.8090277777777778 | 16.636 |
| 0.8097222222222222 | 16.636 |
| 0.8104166666666667 | 16.636 |
| 0.811111111111111 | 16.636 |
| 0.8118055555555556 | 16.636 |
| 0.8125 | 16.636 |
| 0.8131944444444444 | 16.636 |
| 0.813888888888889 | 16.636 |
| 0.8145833333333333 | 16.636 |
| 0.8152777777777778 | 16.636 |
| 0.8159722222222222 | 16.636 |
| 0.8166666666666668 | 16.636 |
| 0.8173611111111111 | 16.636 |
| 0.8180555555555555 | 16.636 |
| 0.81875 | 16.636 |
| 0.8194444444444445 | 12.257 |
| 0.8201388888888889 | 16.636 |
| 0.8208333333333333 | 12.257 |
| 0.8215277777777777 | 12.257 |
| 0.8222222222222223 | 12.257 |
| 0.8229166666666666 | 12.257 |
| 0.8236111111111111 | 12.257 |
| 0.8243055555555556 | 12.257 |
| 0.8250000000000001 | 12.257 |
| 0.8256944444444444 | 12.257 |
| 0.8263888888888888 | 7.887 |
| 0.8270833333333334 | 7.887 |
| 0.8277777777777778 | 7.887 |
| 0.8284722222222222 | 3.525 |
| 0.8291666666666666 | 3.525 |
| 0.8298611111111112 | 3.525 |
| 0.8305555555555556 | 3.525 |
| 0.8312499999999999 | 3.525 |
| 0.8319444444444444 | 3.525 |
| 0.8326388888888889 | 3.525 |
| 0.8333333333333334 | 3.525 |
| 0.8340277777777777 | 3.525 |
| 0.8347222222222223 | 3.525 |
| 0.8354166666666667 | 0 |
| 0.8361111111111111 | 0 |
| 0.8368055555555555 | 0 |
| 0.8375 | 0 |
| 0.8381944444444445 | 0 |
| 0.8388888888888889 | 0 |
| 0.8395833333333332 | 0 |
| 0.8402777777777778 | 0 |
| 0.8409722222222222 | 0 |
| 0.8416666666666667 | 0 |
| 0.842361111111111 | 0 |
| 0.8430555555555556 | 0 |
| 0.84375 | 0 |
| 0.8444444444444444 | 0 |
| 0.845138888888889 | 0 |
| 0.8458333333333333 | 0 |
| 0.8465277777777778 | 0 |
| 0.8472222222222222 | 0 |
| 0.8479166666666668 | 0 |
| 0.8486111111111111 | 0 |
| 0.8493055555555555 | 0 |
| 0.85 | 0 |
| 0.8506944444444445 | 0 |
| 0.8513888888888889 | 0 |
| 0.8520833333333333 | 0 |
| 0.8527777777777777 | 0 |
| 0.8534722222222223 | 0 |
| 0.8541666666666666 | 0 |
| 0.8548611111111111 | 0 |
| 0.8555555555555556 | 0 |
| 0.8562500000000001 | 0 |
| 0.8569444444444444 | 0 |
| 0.8576388888888888 | 0 |
| 0.8583333333333334 | 0 |
| 0.8590277777777778 | 0 |
| 0.8597222222222222 | 0 |
| 0.8604166666666666 | 0 |
| 0.8611111111111112 | 0 |
| 0.8618055555555556 | 0 |
| 0.8624999999999999 | 0 |
| 0.8631944444444444 | 0 |
| 0.8638888888888889 | 0 |
| 0.8645833333333334 | 0 |
| 0.8652777777777777 | 0 |
| 0.8659722222222223 | 0 |
| 0.8666666666666667 | 0 |
| 0.8673611111111111 | 0 |
| 0.8680555555555555 | 0 |
| 0.86875 | 0 |
| 0.8694444444444445 | 0 |
| 0.8701388888888889 | 0 |
| 0.8708333333333332 | 0 |
| 0.8715277777777778 | 0 |
| 0.8722222222222222 | 0 |
| 0.8729166666666667 | 0 |
| 0.873611111111111 | 0 |
| 0.8743055555555556 | 0 |
| 0.875 | 0 |
| 0.8756944444444444 | 0 |
| 0.876388888888889 | 0 |
| 0.8770833333333333 | 0 |
| 0.8777777777777778 | 0 |
| 0.8784722222222222 | 0 |
| 0.8791666666666668 | 0 |
| 0.8798611111111111 | 0 |
| 0.8805555555555555 | 0 |
| 0.88125 | 0 |
| 0.8819444444444445 | 0 |
| 0.8826388888888889 | 0 |
| 0.8833333333333333 | 0 |
| 0.8840277777777777 | 0 |
| 0.8847222222222223 | 0 |
| 0.8854166666666666 | 0 |
| 0.8861111111111111 | 0 |
| 0.8868055555555556 | 0 |
| 0.8875000000000001 | 0 |
| 0.8881944444444444 | 0 |
| 0.8888888888888888 | 0 |
| 0.8895833333333334 | 0 |
| 0.8902777777777778 | 0 |
| 0.8909722222222222 | 0 |
| 0.8916666666666666 | 0 |
| 0.8923611111111112 | 0 |
| 0.8930555555555556 | 0 |
| 0.8937499999999999 | 0 |
| 0.8944444444444444 | 0 |
| 0.8951388888888889 | 0 |
| 0.8958333333333334 | 0 |
| 0.8965277777777777 | 0 |
| 0.8972222222222223 | 0 |
| 0.8979166666666667 | 0 |
| 0.8986111111111111 | 0 |
| 0.8993055555555555 | 0 |
| 0.9 | 0 |
| 0.9006944444444445 | 0 |
| 0.9013888888888889 | 0 |
| 0.9020833333333332 | 0 |
| 0.9027777777777778 | 0 |
| 0.9034722222222222 | 0 |
| 0.9041666666666667 | 0 |
| 0.904861111111111 | 0 |
| 0.9055555555555556 | 0 |
| 0.90625 | 0 |
| 0.9069444444444444 | 0 |
| 0.907638888888889 | 0 |
| 0.9083333333333333 | 0 |
| 0.9090277777777778 | 0 |
| 0.9097222222222222 | 0 |
| 0.9104166666666668 | 0 |
| 0.9111111111111111 | 0 |
| 0.9118055555555555 | 0 |
| 0.9125 | 0 |
| 0.9131944444444445 | 0 |
| 0.9138888888888889 | 0 |
| 0.9145833333333333 | 0 |
| 0.9152777777777777 | 0 |
| 0.9159722222222223 | 0 |
| 0.9166666666666666 | 0 |
| 0.9173611111111111 | 0 |
| 0.9180555555555556 | 0 |
| 0.9187500000000001 | 0 |
| 0.9194444444444444 | 0 |
| 0.9201388888888888 | 0 |
| 0.9208333333333334 | 0 |
| 0.9215277777777778 | 0 |
| 0.9222222222222222 | 0 |
| 0.9229166666666666 | 0 |
| 0.9236111111111112 | 0 |
| 0.9243055555555556 | 0 |
| 0.9249999999999999 | 0 |
| 0.9256944444444444 | 0 |
| 0.9263888888888889 | 0 |
| 0.9270833333333334 | 0 |
| 0.9277777777777777 | 0 |
| 0.9284722222222223 | 0 |
| 0.9291666666666667 | 0 |
| 0.9298611111111111 | 0 |
| 0.9305555555555555 | 0 |
| 0.93125 | 0 |
| 0.9319444444444445 | 0 |
| 0.9326388888888889 | 0 |
| 0.9333333333333332 | 0 |
| 0.9340277777777778 | 0 |
| 0.9347222222222222 | 0 |
| 0.9354166666666667 | 0 |
| 0.936111111111111 | 0 |
| 0.9368055555555556 | 0 |
| 0.9375 | 0 |
| 0.9381944444444444 | 0 |
| 0.938888888888889 | 0 |
| 0.9395833333333333 | 0 |
| 0.9402777777777778 | 0 |
| 0.9409722222222222 | 0 |
| 0.9416666666666668 | 0 |
| 0.9423611111111111 | 0 |
| 0.9430555555555555 | 0 |
| 0.94375 | 0 |
| 0.9444444444444445 | 0 |
| 0.9451388888888889 | 0 |
| 0.9458333333333333 | 0 |
| 0.9465277777777777 | 0 |
| 0.9472222222222223 | 0 |
| 0.9479166666666666 | 0 |
| 0.9486111111111111 | 0 |
| 0.9493055555555556 | 0 |
| 0.9500000000000001 | 0 |
| 0.9506944444444444 | 0 |
| 0.9513888888888888 | 0 |
| 0.9520833333333334 | 0 |
| 0.9527777777777778 | 0 |
| 0.9534722222222222 | 0 |
| 0.9541666666666666 | 0 |
| 0.9548611111111112 | 0 |
| 0.9555555555555556 | 0 |
| 0.9562499999999999 | 0 |
| 0.9569444444444444 | 0 |
| 0.9576388888888889 | 0 |
| 0.9583333333333334 | 0 |
| 0.9590277777777777 | 0 |
| 0.9597222222222223 | 0 |
| 0.9604166666666667 | 0 |
| 0.9611111111111111 | 0 |
| 0.9618055555555555 | 0 |
| 0.9625 | 0 |
| 0.9631944444444445 | 0 |
| 0.9638888888888889 | 0 |
| 0.9645833333333332 | 0 |
| 0.9652777777777778 | 0 |
| 0.9659722222222222 | 0 |
| 0.9666666666666667 | 0 |
| 0.967361111111111 | 0 |
| 0.9680555555555556 | 0 |
| 0.96875 | 0 |
| 0.9694444444444444 | 0 |
| 0.970138888888889 | 0 |
| 0.9708333333333333 | 0 |
| 0.9715277777777778 | 0 |
| 0.9722222222222222 | 0 |
| 0.9729166666666668 | 0 |
| 0.9736111111111111 | 0 |
| 0.9743055555555555 | 0 |
| 0.975 | 0 |
| 0.9756944444444445 | 0 |
| 0.9763888888888889 | 0 |
| 0.9770833333333333 | 0 |
| 0.9777777777777777 | 0 |
| 0.9784722222222223 | 0 |
| 0.9791666666666666 | 0 |
| 0.9798611111111111 | 0 |
| 0.9805555555555556 | 0 |
| 0.9812500000000001 | 0 |
| 0.9819444444444444 | 0 |
| 0.9826388888888888 | 0 |
| 0.9833333333333334 | 0 |
| 0.9840277777777778 | 0 |
| 0.9847222222222222 | 0 |
| 0.9854166666666666 | 0 |
| 0.9861111111111112 | 0 |
| 0.9868055555555556 | 0 |
| 0.9874999999999999 | 0 |
| 0.9881944444444444 | 0 |
| 0.9888888888888889 | 0 |
| 0.9895833333333334 | 0 |
| 0.9902777777777777 | 0 |
| 0.9909722222222223 | 0 |
| 0.9916666666666667 | 0 |
| 0.9923611111111111 | 0 |
| 0.9930555555555555 | 0 |
| 0.99375 | 0 |
| 0.9944444444444445 | 0 |
| 0.9951388888888889 | 0 |
| 0.9958333333333332 | 0 |
| 0.9965277777777778 | 0 |
| 0.9972222222222222 | 0 |
| 0.9979166666666667 | 0 |
| 0.998611111111111 | 0 |
| 0.9993055555555556 | 0 |